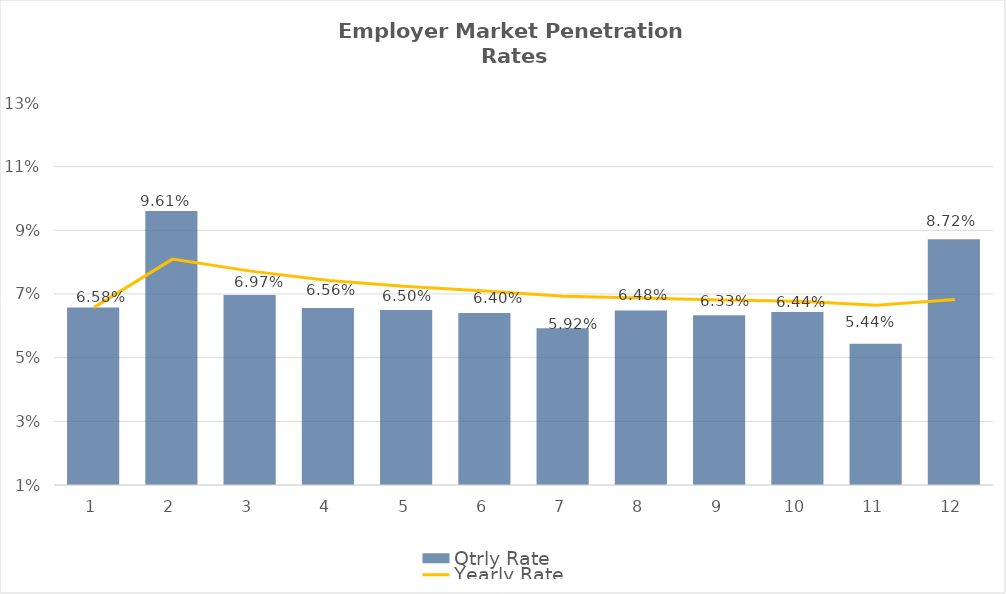
| Category | Qtrly Rate |
|---|---|
| 0 | 0.066 |
| 1 | 0.096 |
| 2 | 0.07 |
| 3 | 0.066 |
| 4 | 0.065 |
| 5 | 0.064 |
| 6 | 0.059 |
| 7 | 0.065 |
| 8 | 0.063 |
| 9 | 0.064 |
| 10 | 0.054 |
| 11 | 0.087 |